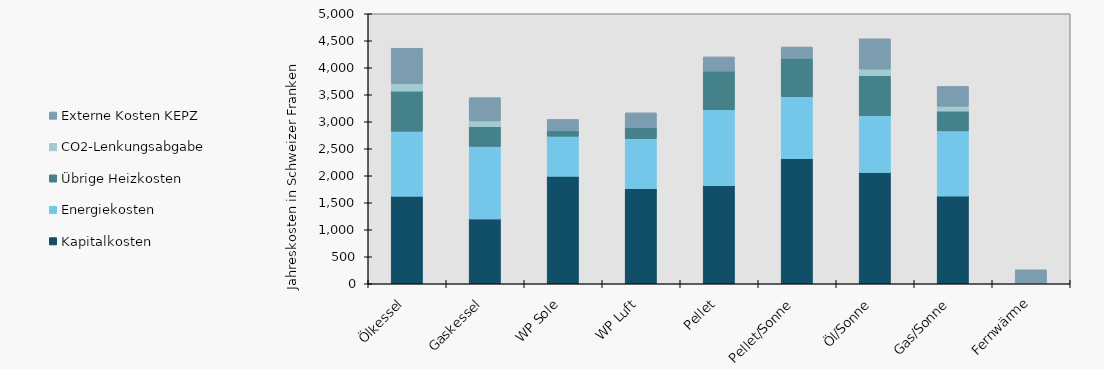
| Category | Kapitalkosten | Energiekosten | Übrige Heizkosten | CO2-Lenkungsabgabe | Externe Kosten KEPZ |
|---|---|---|---|---|---|
| Ölkessel | 1621.098 | 1203.341 | 743.273 | 139.496 | 654.543 |
| Gaskessel | 1201.28 | 1342.513 | 367 | 104.509 | 431.998 |
| WP Sole | 1989.776 | 742.762 | 100 | 0 | 211.764 |
| WP Luft | 1759.276 | 929.766 | 200 | 0 | 276.922 |
| Pellet | 1815.293 | 1406.156 | 717.017 | 0 | 263.414 |
| Pellet/Sonne | 2317.003 | 1145.925 | 711.613 | 0 | 210.731 |
| Öl/Sonne | 2061.078 | 1054.277 | 739.984 | 119.782 | 562.039 |
| Gas/Sonne | 1624.288 | 1207.136 | 367 | 88.833 | 367.199 |
| Fernwärme | 0 | 0 | 0 | 0 | 259.199 |